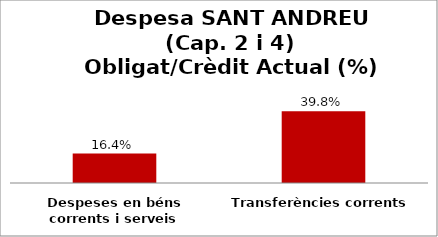
| Category | Series 0 |
|---|---|
| Despeses en béns corrents i serveis | 0.164 |
| Transferències corrents | 0.398 |